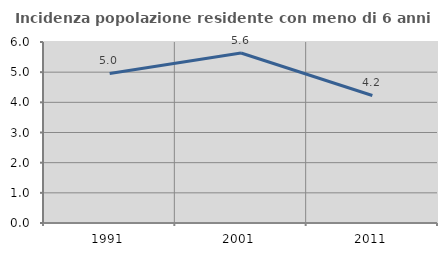
| Category | Incidenza popolazione residente con meno di 6 anni |
|---|---|
| 1991.0 | 4.959 |
| 2001.0 | 5.635 |
| 2011.0 | 4.227 |